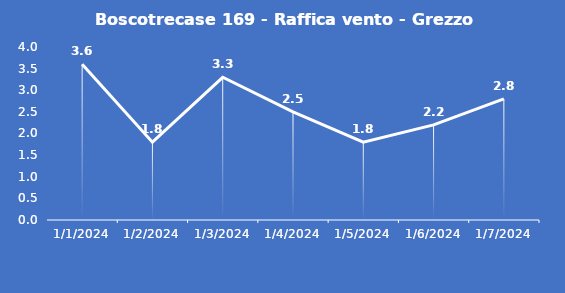
| Category | Boscotrecase 169 - Raffica vento - Grezzo (m/s) |
|---|---|
| 1/1/24 | 3.6 |
| 1/2/24 | 1.8 |
| 1/3/24 | 3.3 |
| 1/4/24 | 2.5 |
| 1/5/24 | 1.8 |
| 1/6/24 | 2.2 |
| 1/7/24 | 2.8 |